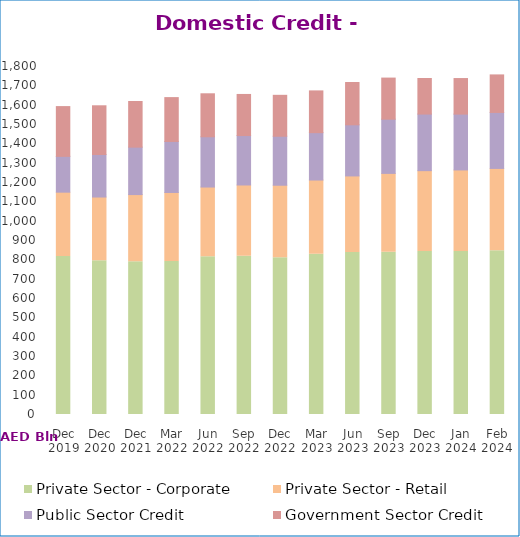
| Category | Private Sector - Corporate | Private Sector - Retail | Public Sector Credit | Government Sector Credit |
|---|---|---|---|---|
| Dec 2019 | 817548 | 332405 | 185273 | 257383 |
| Dec 2020 | 795439 | 329474 | 219950 | 251923 |
| Dec 2021 | 789914 | 347614 | 245391 | 236038 |
| Mar 2022 | 791667 | 356753 | 263874 | 226815 |
| Jun 2022 | 815321 | 361195 | 259981 | 222366 |
| Sep 2022 | 818574 | 368603 | 255704 | 212527 |
| Dec 2022 | 811125 | 374776 | 253306 | 211730 |
| Mar 2023 | 828614 | 384115 | 245080 | 215976 |
| Jun 2023 | 838150 | 395814 | 264400 | 218752 |
| Sep 2023 | 839021 | 408138 | 280361 | 212566 |
| Dec 2023 | 843296 | 417992 | 292640 | 184115 |
| Jan 2024 | 842800 | 422210 | 288745 | 183942 |
| Feb 2024 | 846530 | 426256 | 289535 | 194176 |